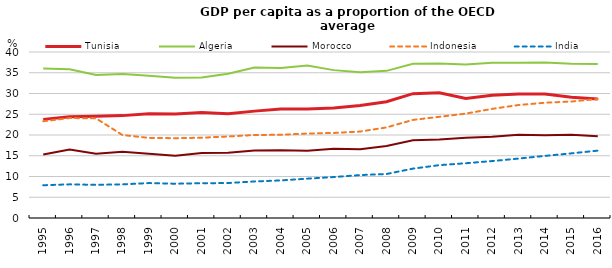
| Category | Tunisia | Algeria | Morocco | Indonesia | India |
|---|---|---|---|---|---|
| 1995.0 | 23.763 | 36.027 | 15.318 | 23.304 | 7.894 |
| 1996.0 | 24.397 | 35.866 | 16.515 | 24.089 | 8.106 |
| 1997.0 | 24.5 | 34.457 | 15.492 | 24.004 | 7.994 |
| 1998.0 | 24.67 | 34.706 | 15.96 | 20 | 8.106 |
| 1999.0 | 25.138 | 34.304 | 15.484 | 19.309 | 8.416 |
| 2000.0 | 25.081 | 33.814 | 15.01 | 19.226 | 8.262 |
| 2001.0 | 25.405 | 33.851 | 15.68 | 19.348 | 8.381 |
| 2002.0 | 25.15 | 34.766 | 15.746 | 19.638 | 8.424 |
| 2003.0 | 25.752 | 36.263 | 16.259 | 19.998 | 8.806 |
| 2004.0 | 26.283 | 36.144 | 16.314 | 20.057 | 9.054 |
| 2005.0 | 26.253 | 36.75 | 16.219 | 20.353 | 9.48 |
| 2006.0 | 26.487 | 35.631 | 16.691 | 20.493 | 9.868 |
| 2007.0 | 27.119 | 35.151 | 16.555 | 20.834 | 10.343 |
| 2008.0 | 28.015 | 35.456 | 17.356 | 21.824 | 10.605 |
| 2009.0 | 29.955 | 37.159 | 18.748 | 23.637 | 11.899 |
| 2010.0 | 30.172 | 37.21 | 18.904 | 24.382 | 12.734 |
| 2011.0 | 28.805 | 36.973 | 19.319 | 25.154 | 13.195 |
| 2012.0 | 29.577 | 37.416 | 19.593 | 26.299 | 13.724 |
| 2013.0 | 29.866 | 37.416 | 20.045 | 27.224 | 14.323 |
| 2014.0 | 29.854 | 37.44 | 19.951 | 27.776 | 14.966 |
| 2015.0 | 29.106 | 37.16 | 20.056 | 28.071 | 15.579 |
| 2016.0 | 28.647 | 37.091 | 19.709 | 28.681 | 16.233 |